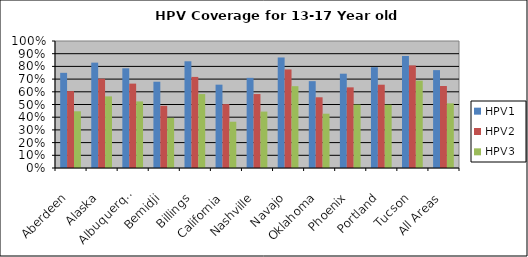
| Category | HPV1  | HPV2  | HPV3  |
|---|---|---|---|
| Aberdeen | 0.749 | 0.606 | 0.447 |
| Alaska | 0.83 | 0.703 | 0.564 |
| Albuquerque | 0.785 | 0.664 | 0.524 |
| Bemidji | 0.679 | 0.49 | 0.395 |
| Billings | 0.84 | 0.717 | 0.582 |
| California | 0.656 | 0.503 | 0.364 |
| Nashville | 0.71 | 0.582 | 0.444 |
| Navajo | 0.87 | 0.776 | 0.644 |
| Oklahoma | 0.684 | 0.557 | 0.428 |
| Phoenix | 0.743 | 0.635 | 0.5 |
| Portland | 0.794 | 0.656 | 0.498 |
| Tucson | 0.882 | 0.808 | 0.688 |
| All Areas | 0.771 | 0.645 | 0.509 |